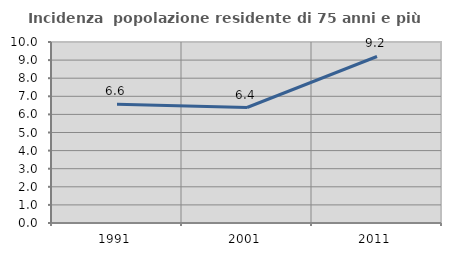
| Category | Incidenza  popolazione residente di 75 anni e più |
|---|---|
| 1991.0 | 6.567 |
| 2001.0 | 6.381 |
| 2011.0 | 9.199 |